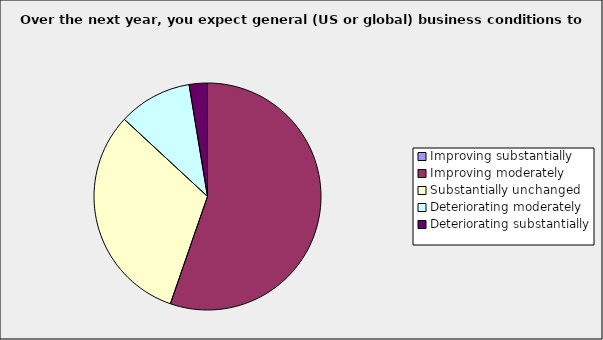
| Category | Series 0 |
|---|---|
| Improving substantially | 0 |
| Improving moderately | 0.553 |
| Substantially unchanged | 0.316 |
| Deteriorating moderately | 0.105 |
| Deteriorating substantially | 0.026 |